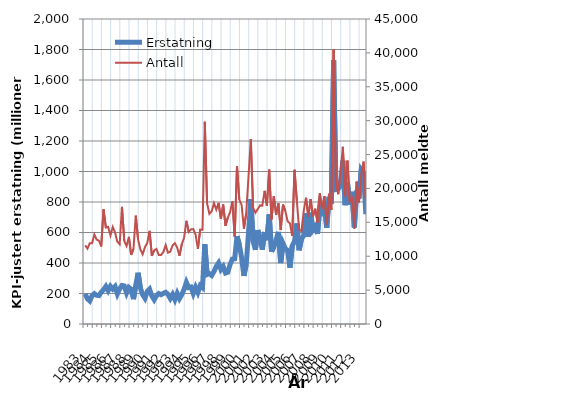
| Category | Erstatning |
|---|---|
| 1983.0 | 197.588 |
| nan | 165.511 |
| nan | 151.359 |
| nan | 185.41 |
| 1984.0 | 198.82 |
| nan | 188.069 |
| nan | 186.467 |
| nan | 208.564 |
| 1985.0 | 225.381 |
| nan | 246.348 |
| nan | 218.294 |
| nan | 247.574 |
| 1986.0 | 229.539 |
| nan | 245.617 |
| nan | 197.688 |
| nan | 231.341 |
| 1987.0 | 252.735 |
| nan | 249.403 |
| nan | 204.097 |
| nan | 240.126 |
| 1988.0 | 228.552 |
| nan | 162.922 |
| nan | 253.756 |
| nan | 336.155 |
| 1989.0 | 237.486 |
| nan | 191.945 |
| nan | 168.896 |
| nan | 213.081 |
| 1990.0 | 228.154 |
| nan | 183.55 |
| nan | 159.187 |
| nan | 185.288 |
| 1991.0 | 199.943 |
| nan | 192.245 |
| nan | 201.197 |
| nan | 208.012 |
| 1992.0 | 194.322 |
| nan | 167.439 |
| nan | 193.471 |
| nan | 159.652 |
| 1993.0 | 200.319 |
| nan | 166.71 |
| nan | 192.604 |
| nan | 227.856 |
| 1994.0 | 272.908 |
| nan | 238.583 |
| nan | 242.398 |
| nan | 199.796 |
| 1995.0 | 240.712 |
| nan | 207.084 |
| nan | 251.629 |
| nan | 238.909 |
| 1996.0 | 523.926 |
| nan | 324.424 |
| nan | 330.22 |
| nan | 318.471 |
| 1997.0 | 344.773 |
| nan | 378.33 |
| nan | 400.656 |
| nan | 357.477 |
| 1998.0 | 377.13 |
| nan | 334.101 |
| nan | 339.56 |
| nan | 390.285 |
| 1999.0 | 425.689 |
| nan | 427.757 |
| nan | 575.602 |
| nan | 521.283 |
| 2000.0 | 434.524 |
| nan | 315.56 |
| nan | 391.205 |
| nan | 596.467 |
| 2001.0 | 818.583 |
| nan | 541.905 |
| nan | 486.703 |
| nan | 615.779 |
| 2002.0 | 560.824 |
| nan | 487.972 |
| nan | 603.049 |
| nan | 549.512 |
| 2003.0 | 718.687 |
| nan | 475.17 |
| nan | 505.52 |
| nan | 550.69 |
| 2004.0 | 604.137 |
| nan | 399.414 |
| nan | 528.042 |
| nan | 493.557 |
| 2005.0 | 483.071 |
| nan | 368.65 |
| nan | 511.786 |
| nan | 542.365 |
| 2006.0 | 659.254 |
| nan | 483.472 |
| nan | 556.294 |
| nan | 580.368 |
| 2007.0 | 726.446 |
| nan | 571.14 |
| nan | 729.727 |
| nan | 616.971 |
| 2008.0 | 638.028 |
| nan | 590.654 |
| nan | 771.428 |
| nan | 740.877 |
| 2009.0 | 777.468 |
| nan | 631.18 |
| nan | 833.772 |
| nan | 788.089 |
| 2010.0 | 1728.747 |
| nan | 881.747 |
| nan | 885.989 |
| nan | 906.404 |
| 2011.0 | 1071.204 |
| nan | 778.954 |
| nan | 928.783 |
| nan | 782.745 |
| 2012.0 | 867.175 |
| nan | 633.984 |
| nan | 874.087 |
| nan | 823.035 |
| 2013.0 | 1010.773 |
| nan | 989.738 |
| nan | 720.179 |